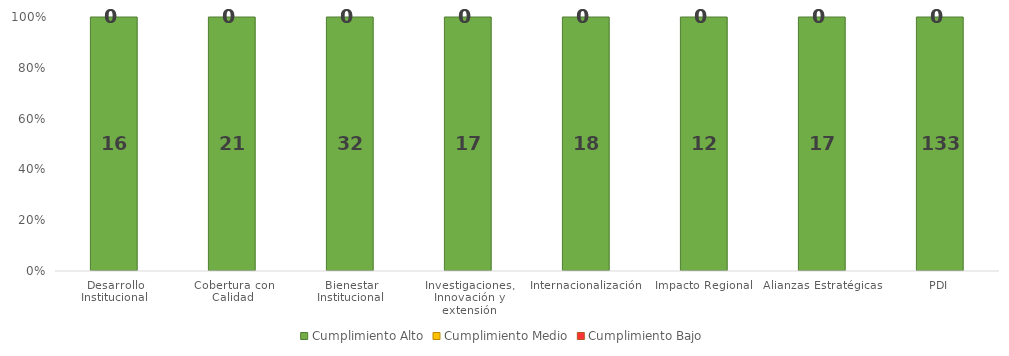
| Category | Cumplimiento Alto | Cumplimiento Medio | Cumplimiento Bajo |
|---|---|---|---|
| Desarrollo Institucional | 16 | 0 | 0 |
| Cobertura con Calidad | 21 | 0 | 0 |
| Bienestar Institucional | 32 | 0 | 0 |
| Investigaciones, Innovación y extensión | 17 | 0 | 0 |
| Internacionalización | 18 | 0 | 0 |
| Impacto Regional | 12 | 0 | 0 |
| Alianzas Estratégicas | 17 | 0 | 0 |
| PDI | 133 | 0 | 0 |